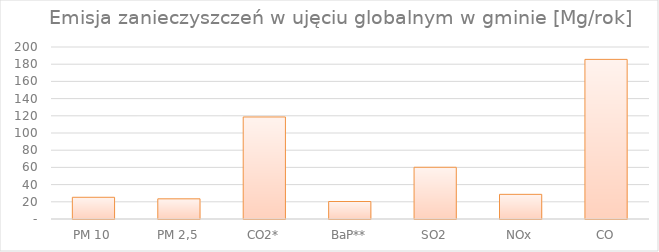
| Category | Series 0 |
|---|---|
| PM 10 | 25.246 |
| PM 2,5 | 23.448 |
| CO2* | 118.627 |
| BaP** | 20.348 |
| SO2 | 60.138 |
| NOx | 28.662 |
| CO | 185.596 |